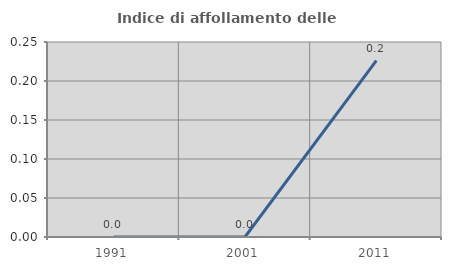
| Category | Indice di affollamento delle abitazioni  |
|---|---|
| 1991.0 | 0 |
| 2001.0 | 0 |
| 2011.0 | 0.226 |